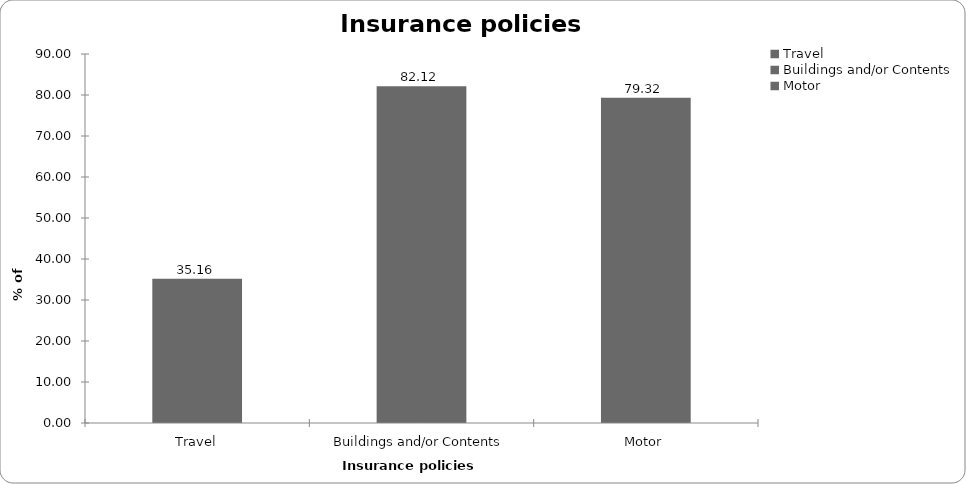
| Category | Insurance policies held |
|---|---|
| Travel | 35.165 |
| Buildings and/or Contents | 82.118 |
| Motor | 79.321 |